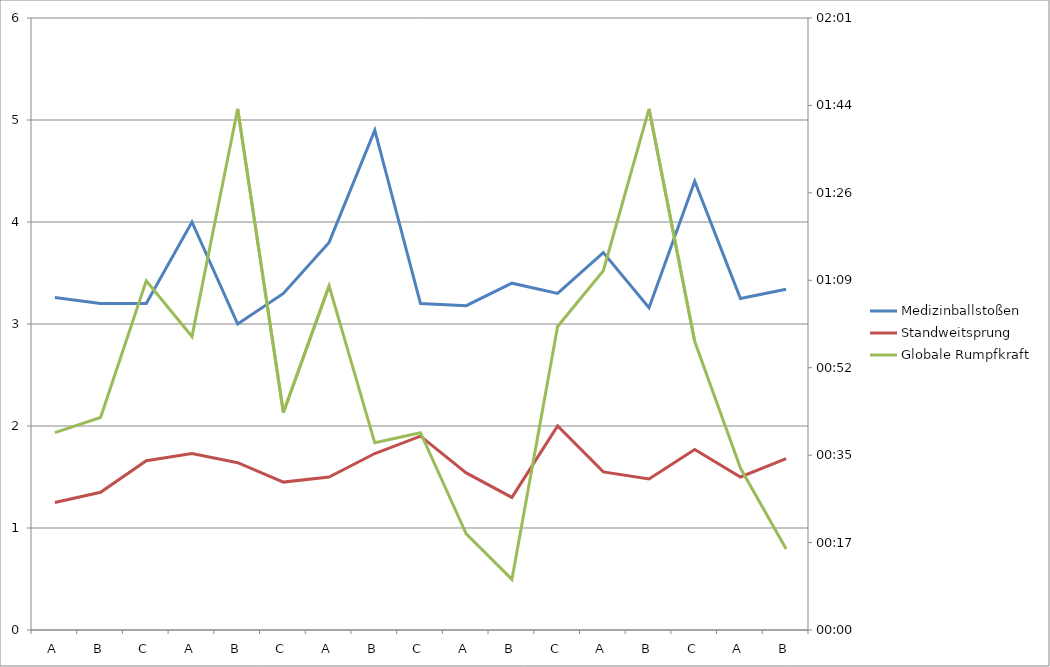
| Category | Medizinballstoßen | Standweitsprung |
|---|---|---|
| A | 3.26 | 1.25 |
| B | 3.2 | 1.35 |
| C | 3.2 | 1.66 |
| A | 4 | 1.73 |
| B | 3 | 1.64 |
| C | 3.3 | 1.45 |
| A | 3.8 | 1.5 |
| B | 4.9 | 1.73 |
| C | 3.2 | 1.9 |
| A | 3.18 | 1.54 |
| B | 3.4 | 1.3 |
| C | 3.3 | 2 |
| A | 3.7 | 1.55 |
| B | 3.16 | 1.48 |
| C | 4.4 | 1.77 |
| A | 3.25 | 1.5 |
| B | 3.34 | 1.68 |